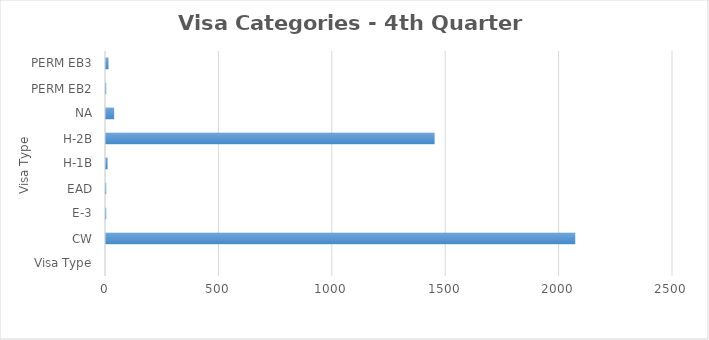
| Category | Series 0 |
|---|---|
| Visa Type | 0 |
| CW | 2069 |
| E-3 | 1 |
| EAD | 1 |
| H-1B | 7 |
| H-2B | 1449 |
| NA | 36 |
| PERM EB2 | 1 |
| PERM EB3 | 11 |